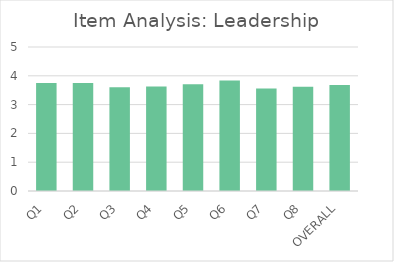
| Category | Series 0 |
|---|---|
| Q1 | 3.75 |
| Q2 | 3.75 |
| Q3 | 3.6 |
| Q4 | 3.63 |
| Q5 | 3.71 |
| Q6 | 3.84 |
| Q7 | 3.56 |
| Q8 | 3.62 |
| OVERALL | 3.68 |